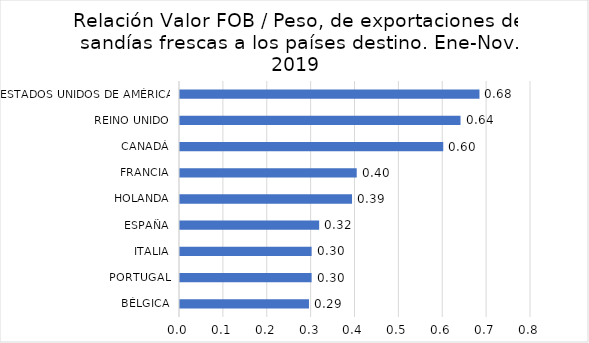
| Category | Series 0 |
|---|---|
| BÉLGICA | 0.294 |
| PORTUGAL | 0.3 |
| ITALIA | 0.3 |
| ESPAÑA | 0.317 |
| HOLANDA | 0.392 |
| FRANCIA | 0.403 |
| CANADÁ | 0.6 |
| REINO UNIDO | 0.639 |
| ESTADOS UNIDOS DE AMÉRICA | 0.683 |